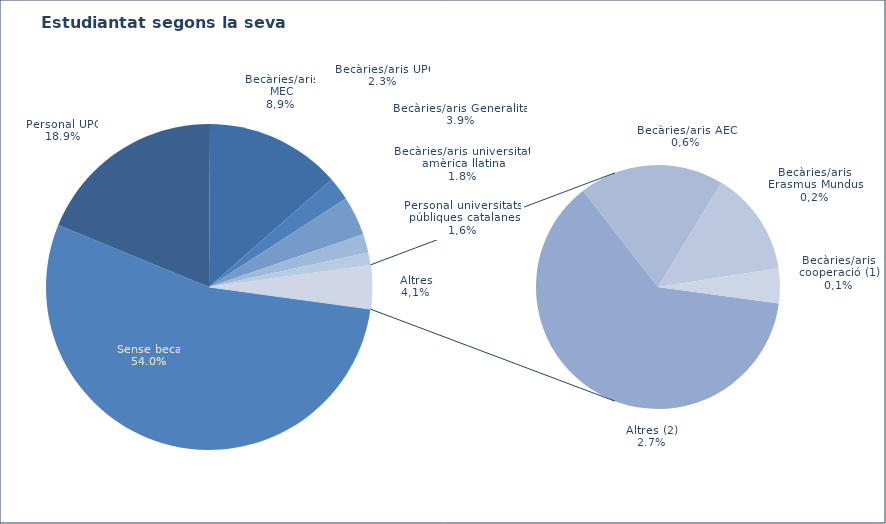
| Category | Series 0 |
|---|---|
| Sense beca | 1621 |
| Personal UPC | 567 |
| Becàries/aris MEC | 403 |
| Becàries/aris UPC | 70 |
| Becàries/aris Generalitat | 117 |
| Becàries/aris universitats amèrica llatina | 55 |
| Personal universitats públiques catalanes | 37 |
| Altres (2) | 81 |
| Becàries/aris AECI | 25 |
| Becàries/aris Erasmus Mundus | 18 |
| Becàries/aris cooperació (1) | 6 |